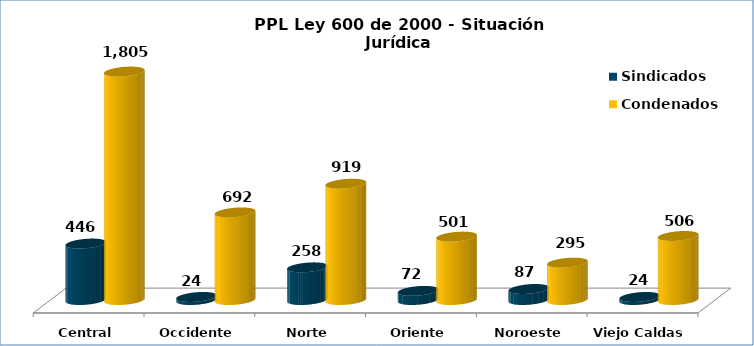
| Category | Sindicados | Condenados |
|---|---|---|
| Central | 446 | 1805 |
| Occidente | 24 | 692 |
| Norte | 258 | 919 |
| Oriente | 72 | 501 |
| Noroeste | 87 | 295 |
| Viejo Caldas | 24 | 506 |